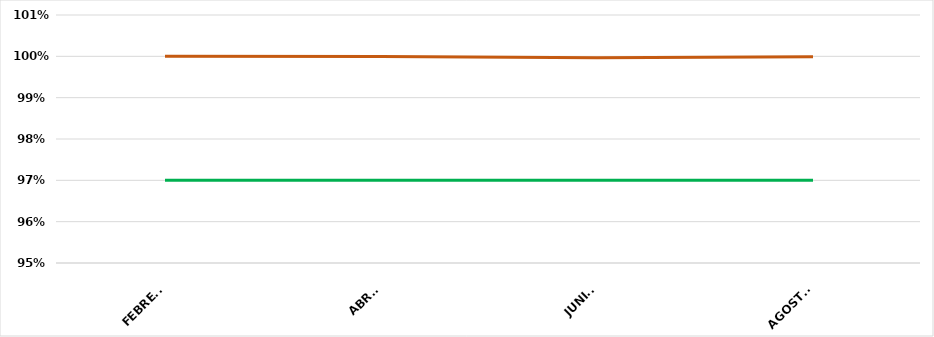
| Category | VALOR  | META PONDERADA |
|---|---|---|
| FEBRERO | 1 | 0.97 |
| ABRIL | 1 | 0.97 |
| JUNIO | 1 | 0.97 |
| AGOSTO | 1 | 0.97 |